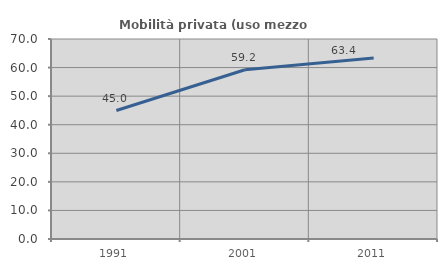
| Category | Mobilità privata (uso mezzo privato) |
|---|---|
| 1991.0 | 44.957 |
| 2001.0 | 59.234 |
| 2011.0 | 63.378 |